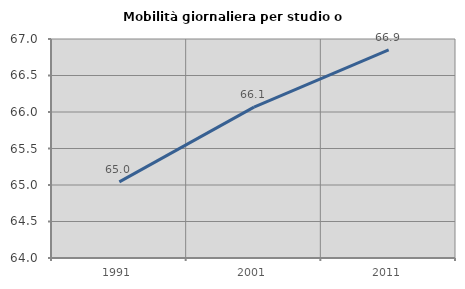
| Category | Mobilità giornaliera per studio o lavoro |
|---|---|
| 1991.0 | 65.042 |
| 2001.0 | 66.066 |
| 2011.0 | 66.85 |